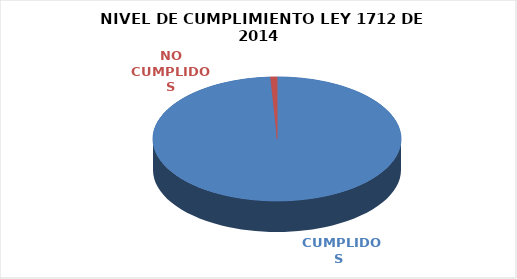
| Category | Series 0 |
|---|---|
|  CUMPLIDOS | 114 |
| NO CUMPLIDOS | 1 |